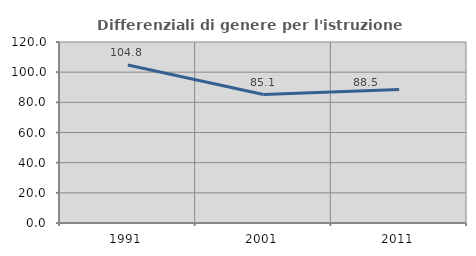
| Category | Differenziali di genere per l'istruzione superiore |
|---|---|
| 1991.0 | 104.788 |
| 2001.0 | 85.138 |
| 2011.0 | 88.532 |